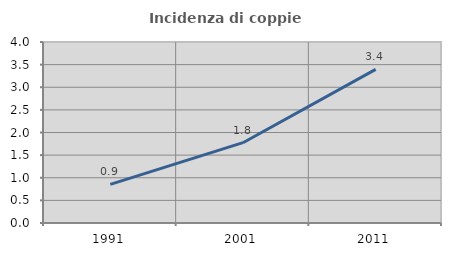
| Category | Incidenza di coppie miste |
|---|---|
| 1991.0 | 0.853 |
| 2001.0 | 1.775 |
| 2011.0 | 3.396 |